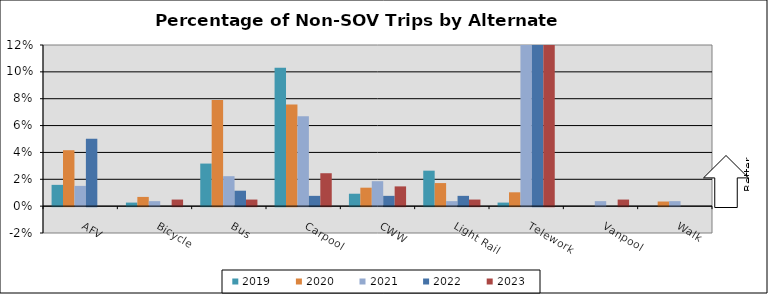
| Category | 2019 | 2020 | 2021 | 2022 | 2023 |
|---|---|---|---|---|---|
| AFV | 0.016 | 0.042 | 0.015 | 0.05 | 0 |
| Bicycle | 0.003 | 0.007 | 0.004 | 0 | 0.005 |
| Bus | 0.032 | 0.079 | 0.022 | 0.011 | 0.005 |
| Carpool | 0.103 | 0.076 | 0.067 | 0.008 | 0.025 |
| CWW | 0.009 | 0.014 | 0.019 | 0.008 | 0.015 |
| Light Rail | 0.026 | 0.017 | 0.004 | 0.008 | 0.005 |
| Telework | 0.003 | 0.01 | 0.294 | 0.326 | 0.647 |
| Vanpool | 0 | 0 | 0.004 | 0 | 0.005 |
| Walk | 0 | 0.003 | 0.004 | 0 | 0 |